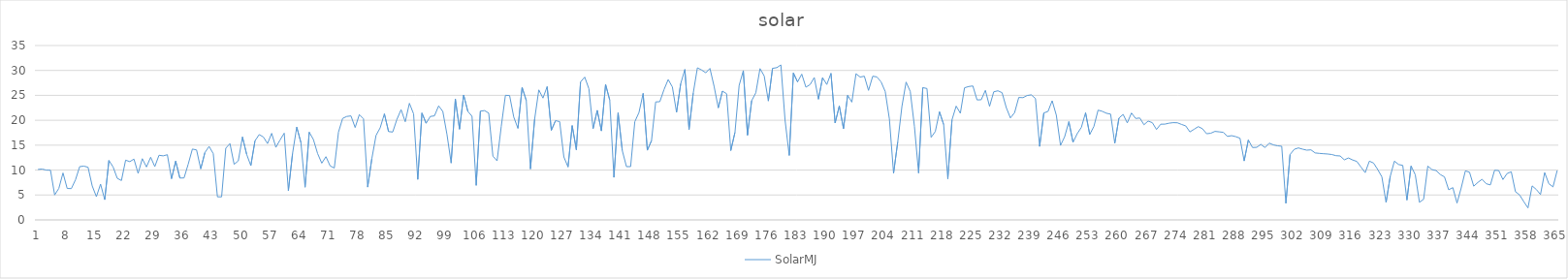
| Category | SolarMJ |
|---|---|
| 0 | 10.136 |
| 1 | 10.206 |
| 2 | 9.995 |
| 3 | 9.972 |
| 4 | 5.008 |
| 5 | 6.326 |
| 6 | 9.424 |
| 7 | 6.315 |
| 8 | 6.284 |
| 9 | 8.073 |
| 10 | 10.696 |
| 11 | 10.794 |
| 12 | 10.567 |
| 13 | 6.819 |
| 14 | 4.663 |
| 15 | 7.182 |
| 16 | 4.06 |
| 17 | 11.94 |
| 18 | 10.623 |
| 19 | 8.35 |
| 20 | 7.904 |
| 21 | 11.991 |
| 22 | 11.696 |
| 23 | 12.203 |
| 24 | 9.344 |
| 25 | 12.289 |
| 26 | 10.627 |
| 27 | 12.576 |
| 28 | 10.706 |
| 29 | 12.979 |
| 30 | 12.852 |
| 31 | 13.084 |
| 32 | 8.265 |
| 33 | 11.797 |
| 34 | 8.401 |
| 35 | 8.422 |
| 36 | 11.19 |
| 37 | 14.219 |
| 38 | 14.042 |
| 39 | 10.243 |
| 40 | 13.522 |
| 41 | 14.751 |
| 42 | 13.304 |
| 43 | 4.631 |
| 44 | 4.63 |
| 45 | 14.383 |
| 46 | 15.326 |
| 47 | 11.157 |
| 48 | 11.853 |
| 49 | 16.65 |
| 50 | 13.173 |
| 51 | 10.888 |
| 52 | 15.869 |
| 53 | 17.124 |
| 54 | 16.648 |
| 55 | 15.322 |
| 56 | 17.377 |
| 57 | 14.567 |
| 58 | 16.036 |
| 59 | 17.414 |
| 60 | 5.859 |
| 61 | 13.335 |
| 62 | 18.632 |
| 63 | 15.544 |
| 64 | 6.565 |
| 65 | 17.614 |
| 66 | 16.119 |
| 67 | 13.327 |
| 68 | 11.386 |
| 69 | 12.688 |
| 70 | 10.846 |
| 71 | 10.411 |
| 72 | 17.61 |
| 73 | 20.38 |
| 74 | 20.767 |
| 75 | 20.875 |
| 76 | 18.541 |
| 77 | 21.143 |
| 78 | 20.287 |
| 79 | 6.59 |
| 80 | 12.311 |
| 81 | 16.962 |
| 82 | 18.493 |
| 83 | 21.294 |
| 84 | 17.73 |
| 85 | 17.637 |
| 86 | 20.173 |
| 87 | 22.133 |
| 88 | 19.703 |
| 89 | 23.409 |
| 90 | 21.274 |
| 91 | 8.128 |
| 92 | 21.455 |
| 93 | 19.407 |
| 94 | 20.762 |
| 95 | 20.886 |
| 96 | 22.887 |
| 97 | 21.771 |
| 98 | 17.141 |
| 99 | 11.42 |
| 100 | 24.275 |
| 101 | 18.211 |
| 102 | 25.058 |
| 103 | 21.783 |
| 104 | 20.8 |
| 105 | 6.934 |
| 106 | 21.835 |
| 107 | 21.94 |
| 108 | 21.446 |
| 109 | 12.797 |
| 110 | 11.854 |
| 111 | 18.758 |
| 112 | 25.01 |
| 113 | 24.96 |
| 114 | 20.638 |
| 115 | 18.387 |
| 116 | 26.591 |
| 117 | 23.963 |
| 118 | 10.221 |
| 119 | 20.213 |
| 120 | 26.096 |
| 121 | 24.457 |
| 122 | 26.754 |
| 123 | 17.983 |
| 124 | 19.92 |
| 125 | 19.739 |
| 126 | 12.638 |
| 127 | 10.626 |
| 128 | 18.928 |
| 129 | 14.071 |
| 130 | 27.696 |
| 131 | 28.664 |
| 132 | 26.334 |
| 133 | 18.302 |
| 134 | 21.989 |
| 135 | 17.867 |
| 136 | 27.195 |
| 137 | 24.037 |
| 138 | 8.542 |
| 139 | 21.485 |
| 140 | 13.917 |
| 141 | 10.693 |
| 142 | 10.699 |
| 143 | 19.708 |
| 144 | 21.559 |
| 145 | 25.399 |
| 146 | 13.987 |
| 147 | 15.89 |
| 148 | 23.681 |
| 149 | 23.733 |
| 150 | 26.163 |
| 151 | 28.169 |
| 152 | 26.689 |
| 153 | 21.6 |
| 154 | 27.361 |
| 155 | 30.203 |
| 156 | 18.149 |
| 157 | 25.44 |
| 158 | 30.522 |
| 159 | 30.095 |
| 160 | 29.537 |
| 161 | 30.407 |
| 162 | 26.804 |
| 163 | 22.489 |
| 164 | 25.86 |
| 165 | 25.321 |
| 166 | 13.912 |
| 167 | 17.572 |
| 168 | 26.997 |
| 169 | 29.957 |
| 170 | 17.008 |
| 171 | 23.931 |
| 172 | 25.519 |
| 173 | 30.368 |
| 174 | 28.898 |
| 175 | 23.877 |
| 176 | 30.418 |
| 177 | 30.556 |
| 178 | 31.1 |
| 179 | 20.036 |
| 180 | 12.94 |
| 181 | 29.482 |
| 182 | 27.701 |
| 183 | 29.258 |
| 184 | 26.641 |
| 185 | 27.162 |
| 186 | 28.581 |
| 187 | 24.229 |
| 188 | 28.548 |
| 189 | 27.177 |
| 190 | 29.422 |
| 191 | 19.459 |
| 192 | 22.867 |
| 193 | 18.32 |
| 194 | 25.021 |
| 195 | 23.643 |
| 196 | 29.337 |
| 197 | 28.666 |
| 198 | 28.845 |
| 199 | 25.994 |
| 200 | 28.836 |
| 201 | 28.701 |
| 202 | 27.715 |
| 203 | 25.779 |
| 204 | 20.252 |
| 205 | 9.369 |
| 206 | 15.656 |
| 207 | 22.765 |
| 208 | 27.666 |
| 209 | 25.783 |
| 210 | 18.776 |
| 211 | 9.415 |
| 212 | 26.545 |
| 213 | 26.372 |
| 214 | 16.574 |
| 215 | 17.746 |
| 216 | 21.705 |
| 217 | 19.136 |
| 218 | 8.252 |
| 219 | 20.108 |
| 220 | 22.844 |
| 221 | 21.413 |
| 222 | 26.515 |
| 223 | 26.771 |
| 224 | 26.887 |
| 225 | 24.085 |
| 226 | 24.123 |
| 227 | 26.002 |
| 228 | 22.798 |
| 229 | 25.712 |
| 230 | 25.917 |
| 231 | 25.537 |
| 232 | 22.545 |
| 233 | 20.463 |
| 234 | 21.538 |
| 235 | 24.581 |
| 236 | 24.54 |
| 237 | 24.965 |
| 238 | 25.103 |
| 239 | 24.356 |
| 240 | 14.75 |
| 241 | 21.466 |
| 242 | 21.771 |
| 243 | 23.914 |
| 244 | 21.005 |
| 245 | 14.956 |
| 246 | 16.714 |
| 247 | 19.724 |
| 248 | 15.56 |
| 249 | 17.311 |
| 250 | 18.585 |
| 251 | 21.51 |
| 252 | 17.148 |
| 253 | 18.763 |
| 254 | 22.032 |
| 255 | 21.795 |
| 256 | 21.406 |
| 257 | 21.239 |
| 258 | 15.385 |
| 259 | 20.437 |
| 260 | 21.167 |
| 261 | 19.478 |
| 262 | 21.456 |
| 263 | 20.364 |
| 264 | 20.454 |
| 265 | 19.103 |
| 266 | 19.844 |
| 267 | 19.514 |
| 268 | 18.149 |
| 269 | 19.213 |
| 270 | 19.227 |
| 271 | 19.417 |
| 272 | 19.525 |
| 273 | 19.496 |
| 274 | 19.167 |
| 275 | 18.869 |
| 276 | 17.665 |
| 277 | 18.186 |
| 278 | 18.722 |
| 279 | 18.308 |
| 280 | 17.297 |
| 281 | 17.396 |
| 282 | 17.768 |
| 283 | 17.679 |
| 284 | 17.574 |
| 285 | 16.765 |
| 286 | 16.909 |
| 287 | 16.704 |
| 288 | 16.398 |
| 289 | 11.837 |
| 290 | 16.04 |
| 291 | 14.531 |
| 292 | 14.563 |
| 293 | 15.16 |
| 294 | 14.523 |
| 295 | 15.412 |
| 296 | 15.062 |
| 297 | 14.87 |
| 298 | 14.787 |
| 299 | 3.34 |
| 300 | 13.127 |
| 301 | 14.169 |
| 302 | 14.448 |
| 303 | 14.197 |
| 304 | 13.998 |
| 305 | 14.062 |
| 306 | 13.445 |
| 307 | 13.353 |
| 308 | 13.288 |
| 309 | 13.227 |
| 310 | 13.124 |
| 311 | 12.892 |
| 312 | 12.836 |
| 313 | 12.064 |
| 314 | 12.431 |
| 315 | 12.026 |
| 316 | 11.734 |
| 317 | 10.599 |
| 318 | 9.491 |
| 319 | 11.795 |
| 320 | 11.413 |
| 321 | 10.117 |
| 322 | 8.628 |
| 323 | 3.503 |
| 324 | 8.732 |
| 325 | 11.802 |
| 326 | 11.125 |
| 327 | 10.939 |
| 328 | 3.981 |
| 329 | 10.823 |
| 330 | 9.058 |
| 331 | 3.533 |
| 332 | 4.143 |
| 333 | 10.795 |
| 334 | 10.102 |
| 335 | 9.906 |
| 336 | 9.108 |
| 337 | 8.632 |
| 338 | 6.045 |
| 339 | 6.478 |
| 340 | 3.38 |
| 341 | 6.408 |
| 342 | 9.841 |
| 343 | 9.573 |
| 344 | 6.773 |
| 345 | 7.525 |
| 346 | 8.156 |
| 347 | 7.259 |
| 348 | 7.033 |
| 349 | 9.969 |
| 350 | 9.911 |
| 351 | 8.1 |
| 352 | 9.312 |
| 353 | 9.661 |
| 354 | 5.666 |
| 355 | 5.003 |
| 356 | 3.662 |
| 357 | 2.403 |
| 358 | 6.829 |
| 359 | 6.113 |
| 360 | 5.098 |
| 361 | 9.506 |
| 362 | 7.263 |
| 363 | 6.631 |
| 364 | 9.909 |